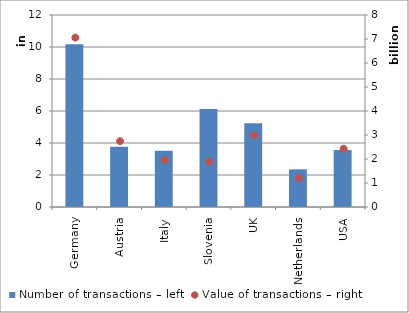
| Category | Number of transactions – left |
|---|---|
| Germany | 10170635 |
| Austria | 3767403 |
| Italy | 3514880 |
| Slovenia | 6119299 |
| UK | 5227876 |
| Netherlands | 2351474 |
| USA | 3561743 |